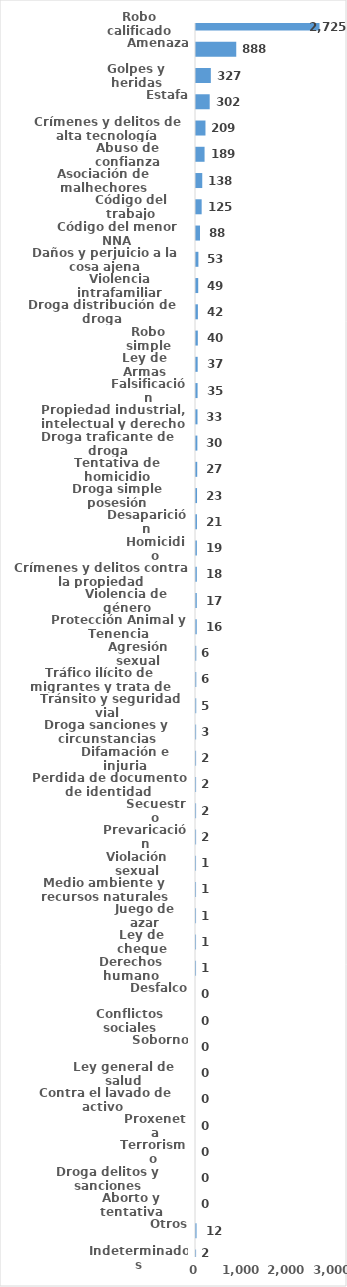
| Category | Series 0 |
|---|---|
| Robo calificado | 2725 |
| Amenaza | 888 |
| Golpes y heridas | 327 |
| Estafa | 302 |
| Crímenes y delitos de alta tecnología | 209 |
| Abuso de confianza | 189 |
| Asociación de malhechores | 138 |
| Código del trabajo | 125 |
| Código del menor NNA | 88 |
| Daños y perjuicio a la cosa ajena | 53 |
| Violencia intrafamiliar | 49 |
| Droga distribución de droga | 42 |
| Robo simple | 40 |
| Ley de Armas | 37 |
| Falsificación | 35 |
| Propiedad industrial, intelectual y derecho de autor | 33 |
| Droga traficante de droga | 30 |
| Tentativa de homicidio | 27 |
| Droga simple posesión | 23 |
| Desaparición | 21 |
| Homicidio | 19 |
| Crímenes y delitos contra la propiedad | 18 |
| Violencia de género | 17 |
| Protección Animal y Tenencia Responsable | 16 |
| Agresión sexual | 6 |
| Tráfico ilícito de migrantes y trata de personas | 6 |
| Tránsito y seguridad vial  | 5 |
| Droga sanciones y circunstancias agravantes | 3 |
| Difamación e injuria | 2 |
| Perdida de documento de identidad | 2 |
| Secuestro | 2 |
| Prevaricación | 2 |
| Violación sexual | 1 |
| Medio ambiente y recursos naturales | 1 |
| Juego de azar | 1 |
| Ley de cheque | 1 |
| Derechos humano | 1 |
| Desfalco | 0 |
| Conflictos sociales | 0 |
| Soborno | 0 |
| Ley general de salud | 0 |
| Contra el lavado de activo  | 0 |
| Proxeneta | 0 |
| Terrorismo | 0 |
| Droga delitos y sanciones | 0 |
| Aborto y tentativa | 0 |
| Otros | 12 |
| Indeterminados | 2 |